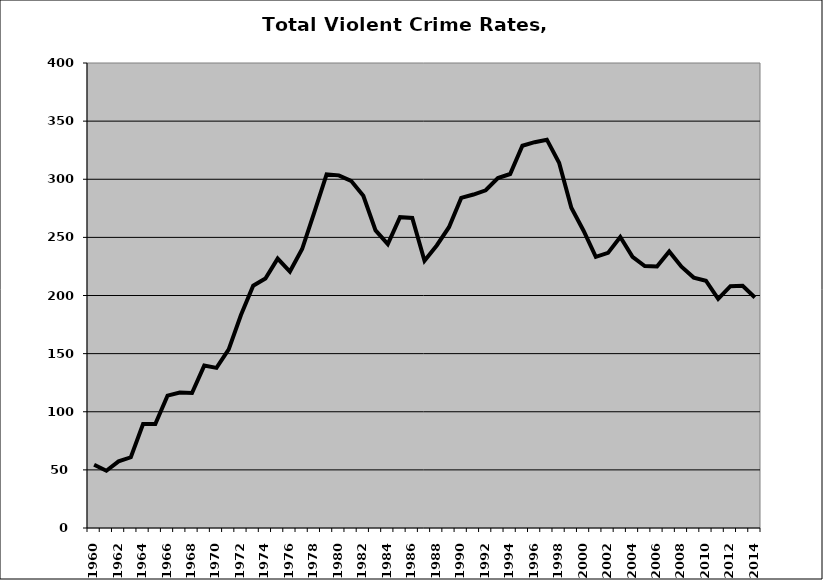
| Category | VCR |
|---|---|
| 1960.0 | 54.344 |
| 1961.0 | 49.236 |
| 1962.0 | 57.291 |
| 1963.0 | 60.834 |
| 1964.0 | 89.516 |
| 1965.0 | 89.495 |
| 1966.0 | 113.889 |
| 1967.0 | 116.602 |
| 1968.0 | 116.151 |
| 1969.0 | 139.713 |
| 1970.0 | 137.736 |
| 1971.0 | 153.685 |
| 1972.0 | 183.215 |
| 1973.0 | 208.47 |
| 1974.0 | 214.578 |
| 1975.0 | 231.758 |
| 1976.0 | 220.603 |
| 1977.0 | 239.984 |
| 1978.0 | 271.767 |
| 1979.0 | 304.17 |
| 1980.0 | 303.346 |
| 1981.0 | 298.615 |
| 1982.0 | 285.714 |
| 1983.0 | 255.96 |
| 1984.0 | 244.249 |
| 1985.0 | 267.356 |
| 1986.0 | 266.727 |
| 1987.0 | 229.821 |
| 1988.0 | 243.051 |
| 1989.0 | 258.758 |
| 1990.0 | 283.948 |
| 1991.0 | 286.836 |
| 1992.0 | 290.513 |
| 1993.0 | 301.022 |
| 1994.0 | 304.507 |
| 1995.0 | 328.806 |
| 1996.0 | 331.9 |
| 1997.0 | 334.046 |
| 1998.0 | 314.238 |
| 1999.0 | 275.561 |
| 2000.0 | 255.735 |
| 2001.0 | 233.202 |
| 2002.0 | 236.675 |
| 2003.0 | 250.37 |
| 2004.0 | 233.279 |
| 2005.0 | 225.351 |
| 2006.0 | 224.936 |
| 2007.0 | 237.929 |
| 2008.0 | 224.761 |
| 2009.0 | 215.401 |
| 2010.0 | 212.708 |
| 2011.0 | 197.097 |
| 2012.0 | 208.03 |
| 2013.0 | 208.351 |
| 2014.0 | 198.342 |